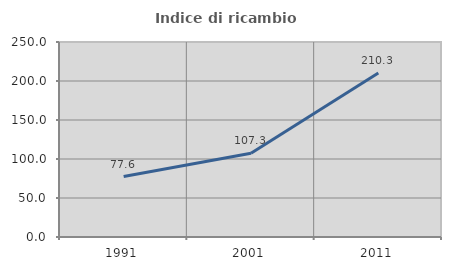
| Category | Indice di ricambio occupazionale  |
|---|---|
| 1991.0 | 77.551 |
| 2001.0 | 107.317 |
| 2011.0 | 210.256 |